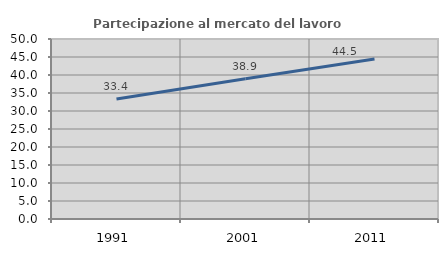
| Category | Partecipazione al mercato del lavoro  femminile |
|---|---|
| 1991.0 | 33.352 |
| 2001.0 | 38.935 |
| 2011.0 | 44.468 |